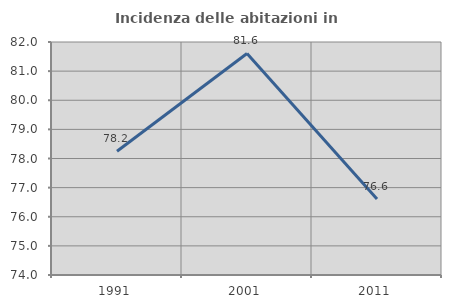
| Category | Incidenza delle abitazioni in proprietà  |
|---|---|
| 1991.0 | 78.248 |
| 2001.0 | 81.605 |
| 2011.0 | 76.61 |